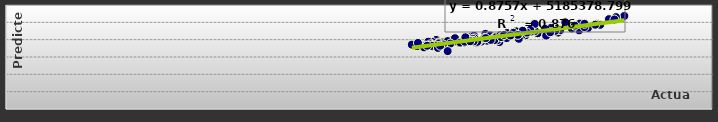
| Category | Series 0 |
|---|---|
| 50205500.0 | 49080295.467 |
| 45182972.0 | 43700274.127 |
| 46925212.0 | 44069212.984 |
| 40611160.0 | 39513844.088 |
| 40093912.0 | 39082940.137 |
| 42370712.0 | 40920251.366 |
| 52548652.0 | 53653882.727 |
| 49452684.0 | 46644713.743 |
| 41925404.0 | 38565671.014 |
| 40507084.0 | 39302319.047 |
| 40896332.0 | 39401383.349 |
| 44967260.0 | 44994792.95 |
| 46829264.0 | 46268182.497 |
| 43072944.0 | 43133258.548 |
| 41849536.0 | 40645363.108 |
| 38334680.0 | 39658239.582 |
| 39723388.0 | 39916834.233 |
| 42958924.0 | 43458885.05 |
| 51833832.0 | 53004571.74 |
| 48709368.0 | 45358164.355 |
| 40386344.0 | 38858397.031 |
| 40191612.0 | 39120205.856 |
| 42546572.0 | 40917610.648 |
| 44574932.0 | 44777456.228 |
| 48092056.0 | 46381239.668 |
| 43415700.0 | 43470744.744 |
| 43520436.0 | 43706701.1 |
| 38293524.0 | 39500961.99 |
| 37947560.0 | 39778937.265 |
| 39558052.0 | 41826944.228 |
| 48777836.0 | 49278306.357 |
| 44931328.0 | 49052392.746 |
| 38566848.0 | 38414873.775 |
| 39059440.0 | 39039528.934 |
| 41311172.0 | 41123737.567 |
| 46300080.0 | 46753233.199 |
| 50496524.0 | 48562376.626 |
| 44559480.0 | 44746008.926 |
| 45832980.0 | 45457545.894 |
| 38389928.0 | 39246261.8 |
| 36955320.0 | 38280481.438 |
| 40743556.0 | 43347075.606 |
| 44141052.0 | 42466216.977 |
| 43108352.0 | 43228272.27 |
| 38472316.0 | 38256693.582 |
| 38196496.0 | 39141416.005 |
| 40658384.0 | 40923657.006 |
| 43373536.0 | 44804823.118 |
| 48336984.0 | 48077644.422 |
| 45806080.0 | 46239387.141 |
| 44467252.0 | 44258677.149 |
| 37066328.0 | 38684509.6 |
| 36561144.0 | 39872136.619 |
| 38156280.0 | 38947065.651 |
| 44608128.0 | 44660247.813 |
| 43859864.0 | 42625481.387 |
| 41747992.0 | 39638241.059 |
| 36786432.0 | 38344349.621 |
| 37158576.0 | 38402869.783 |
| 39769880.0 | 42265106.451 |
| 44548272.0 | 45656889.986 |
| 41158164.0 | 42430898.564 |
| 39809144.0 | 40770980.095 |
| 36222796.0 | 38697160.114 |
| 35890392.0 | 38838360.821 |
| 39662848.0 | 40417432.248 |
| 47528892.0 | 50013715.376 |
| 51243328.0 | 51833163.907 |
| 39994232.0 | 38187529.056 |
| 36210144.0 | 37219979.442 |
| 36789736.0 | 37848018.275 |
| 42575324.0 | 43846487.97 |
| 43131420.0 | 43982289.671 |
| 37533892.0 | 39178971.567 |
| 41563416.0 | 41584100.896 |
| 34947464.0 | 36271674.285 |
| 35633124.0 | 36554323.679 |
| 38155784.0 | 40854636.003 |
| 44273988.0 | 44063438.593 |
| 43579956.0 | 40485762.475 |
| 38972984.0 | 38150605.356 |
| 36256780.0 | 36070069.48 |
| 38948952.0 | 38265565.415 |
| 43911244.0 | 45153861.644 |
| 47094720.0 | 45415520.178 |
| 39631600.0 | 39414405.784 |
| 41656908.0 | 41409284.161 |
| 38614768.0 | 38297750.554 |
| 36061876.0 | 37260019.256 |
| 39000368.0 | 38807899.339 |
| 50076316.0 | 48632371.054 |
| 49158088.0 | 47265968.664 |
| 41496540.0 | 39700510.995 |
| 37763352.0 | 37754870.372 |
| 40051456.0 | 38736343.243 |
| 42019276.0 | 42552632.074 |
| 46678584.0 | 45091528.545 |
| 41194468.0 | 39864815.606 |
| 42090500.0 | 41486735.729 |
| 36539752.0 | 36596224.845 |
| 35532004.0 | 35531804.829 |
| 37150892.0 | 37211903.557 |
| 49164276.0 | 49134553.937 |
| 45907060.0 | 42335190.754 |
| 37534148.0 | 33390347.54 |
| 36176532.0 | 36411821.469 |
| 39737440.0 | 39012104.065 |
| 42323844.0 | 42722765.759 |
| 43498988.0 | 42751057.011 |
| 40767224.0 | 40901291.647 |
| 39452644.0 | 39094530.129 |
| 34488964.0 | 37142644.064 |
| 35010608.0 | 38142634.707 |
| 39038300.0 | 41361144.02 |
| 51707560.0 | 51636108.875 |
| 46254924.0 | 44282359.554 |
| 36708176.0 | 35217895.73 |
| 35798052.0 | 36490637.705 |
| 36898344.0 | 36527121.562 |
| 42870244.0 | 42400424.633 |